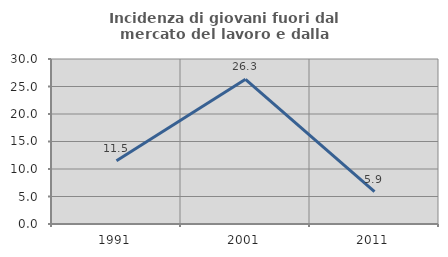
| Category | Incidenza di giovani fuori dal mercato del lavoro e dalla formazione  |
|---|---|
| 1991.0 | 11.494 |
| 2001.0 | 26.316 |
| 2011.0 | 5.882 |